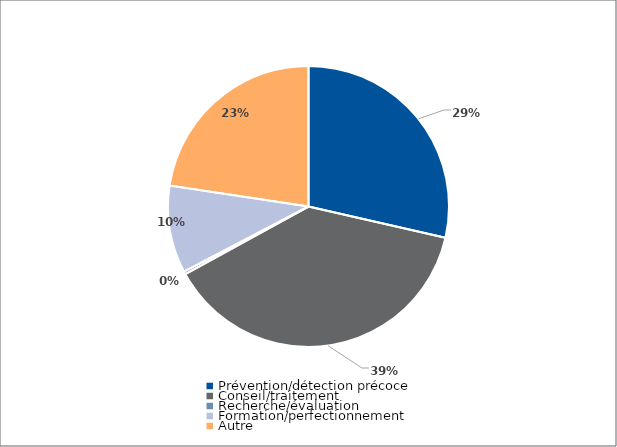
| Category | Series 0 |
|---|---|
| Prévention/détection précoce | 46167 |
| Conseil/traitement | 62100 |
| Recherche/évaluation | 532 |
| Formation/perfectionnement | 16250 |
| Autre | 36542 |